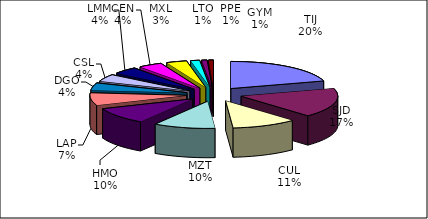
| Category | Series 0 |
|---|---|
| TIJ | 75670 |
| SJD | 64232 |
| CUL | 40238 |
| MZT | 38127 |
| HMO | 36959 |
| LAP | 27389 |
| DGO | 16097 |
| CSL | 15832 |
| LMM | 15695 |
| CEN | 14804 |
| MXL | 12607 |
| LTO | 5486 |
| PPE | 3328 |
| GYM | 2994 |